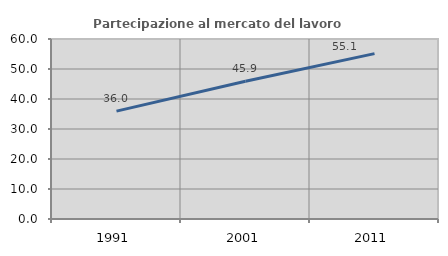
| Category | Partecipazione al mercato del lavoro  femminile |
|---|---|
| 1991.0 | 35.97 |
| 2001.0 | 45.91 |
| 2011.0 | 55.13 |